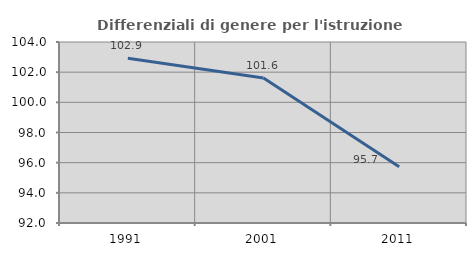
| Category | Differenziali di genere per l'istruzione superiore |
|---|---|
| 1991.0 | 102.916 |
| 2001.0 | 101.614 |
| 2011.0 | 95.722 |